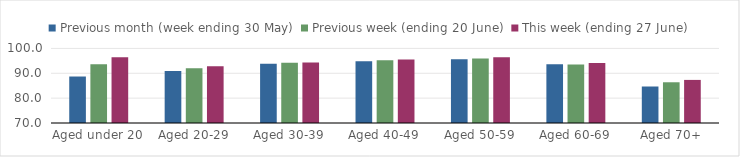
| Category | Previous month (week ending 30 May) | Previous week (ending 20 June) | This week (ending 27 June) |
|---|---|---|---|
| Aged under 20 | 88.701 | 93.605 | 96.423 |
| Aged 20-29 | 90.968 | 92.059 | 92.801 |
| Aged 30-39 | 93.875 | 94.258 | 94.354 |
| Aged 40-49 | 94.852 | 95.208 | 95.595 |
| Aged 50-59 | 95.661 | 95.945 | 96.472 |
| Aged 60-69 | 93.636 | 93.561 | 94.149 |
| Aged 70+ | 84.684 | 86.386 | 87.334 |